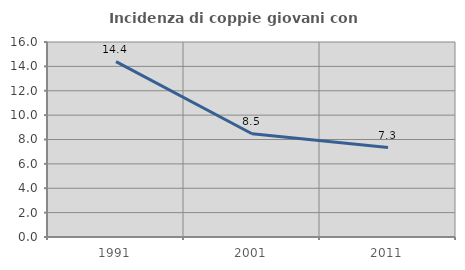
| Category | Incidenza di coppie giovani con figli |
|---|---|
| 1991.0 | 14.388 |
| 2001.0 | 8.475 |
| 2011.0 | 7.342 |